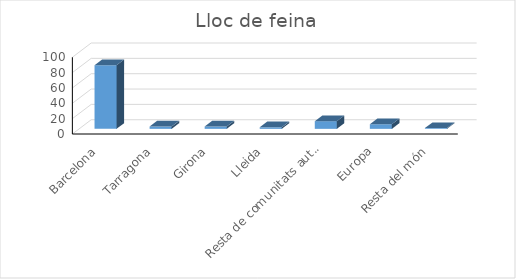
| Category | Series 0 |
|---|---|
| Barcelona | 83 |
| Tarragona | 3 |
| Girona | 3 |
| Lleida | 2 |
| Resta de comunitats autònomes | 10 |
| Europa | 6 |
| Resta del món | 1 |